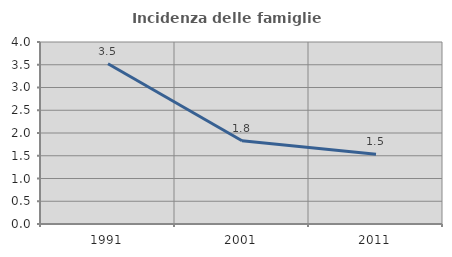
| Category | Incidenza delle famiglie numerose |
|---|---|
| 1991.0 | 3.522 |
| 2001.0 | 1.831 |
| 2011.0 | 1.531 |